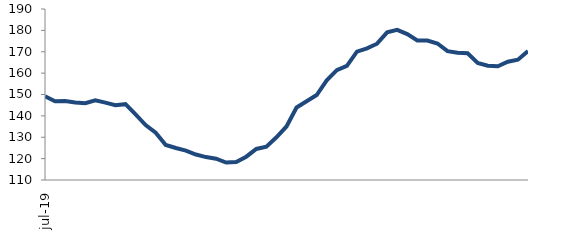
| Category | Series 1 |
|---|---|
| 2019-07-01 | 149.147 |
| 2019-08-01 | 146.814 |
| 2019-09-01 | 146.921 |
| 2019-10-01 | 146.216 |
| 2019-11-01 | 145.952 |
| 2019-12-01 | 147.284 |
| 2020-01-01 | 146.194 |
| 2020-02-01 | 144.98 |
| 2020-03-01 | 145.471 |
| 2020-04-01 | 140.66 |
| 2020-05-01 | 135.678 |
| 2020-06-01 | 132.14 |
| 2020-07-01 | 126.404 |
| 2020-08-01 | 124.978 |
| 2020-09-01 | 123.76 |
| 2020-10-01 | 121.904 |
| 2020-11-01 | 120.729 |
| 2020-12-01 | 119.982 |
| 2021-01-01 | 118.16 |
| 2021-02-01 | 118.385 |
| 2021-03-01 | 120.897 |
| 2021-04-01 | 124.521 |
| 2021-05-01 | 125.561 |
| 2021-06-01 | 129.991 |
| 2021-07-01 | 135.036 |
| 2021-08-01 | 143.93 |
| 2021-09-01 | 146.816 |
| 2021-10-01 | 149.733 |
| 2021-11-01 | 156.598 |
| 2021-12-01 | 161.424 |
| 2022-01-01 | 163.409 |
| 2022-02-01 | 170.051 |
| 2022-03-01 | 171.561 |
| 2022-04-01 | 173.768 |
| 2022-05-01 | 179.049 |
| 2022-06-01 | 180.219 |
| 2022-07-01 | 178.235 |
| 2022-08-01 | 175.283 |
| 2022-09-01 | 175.244 |
| 2022-10-01 | 173.855 |
| 2022-11-01 | 170.303 |
| 2022-12-01 | 169.507 |
| 2023-01-01 | 169.264 |
| 2023-02-01 | 164.751 |
| 2023-03-01 | 163.49 |
| 2023-04-01 | 163.213 |
| 2023-05-01 | 165.362 |
| 2023-06-01 | 166.293 |
| 2023-07-01 | 170.283 |